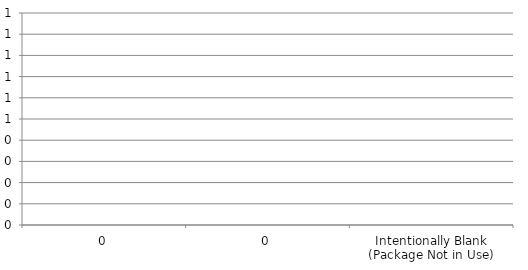
| Category | Series 0 |
|---|---|
| 0 | 0 |
| 0 | 0 |
| Intentionally Blank (Package Not in Use) | 0 |